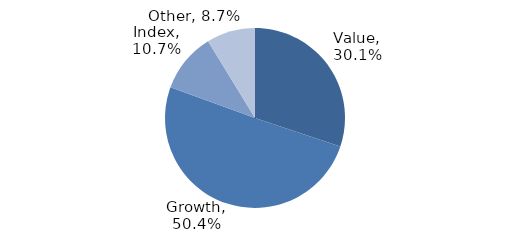
| Category | Investment Style |
|---|---|
| Value | 0.301 |
| Growth | 0.504 |
| Index | 0.107 |
| Other | 0.087 |